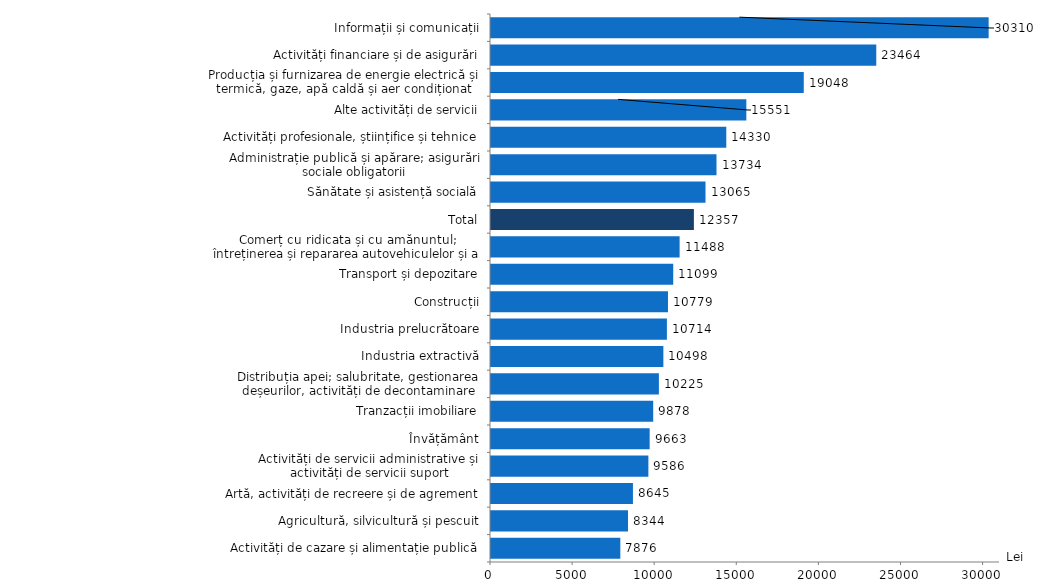
| Category | Lei |
|---|---|
| Activități de cazare și alimentație publică | 7876.2 |
| Agricultură, silvicultură și pescuit | 8344.3 |
| Artă, activități de recreere și de agrement | 8644.9 |
| Activități de servicii administrative și activități de servicii suport | 9585.6 |
| Învățământ | 9662.9 |
| Tranzacții imobiliare | 9878.4 |
| Distribuția apei; salubritate, gestionarea deșeurilor, activități de decontaminare | 10225.1 |
| Industria extractivă | 10497.7 |
| Industria prelucrătoare | 10713.5 |
| Construcții | 10778.8 |
| Transport și depozitare | 11098.6 |
| Comerț cu ridicata și cu amănuntul; întreținerea și repararea autovehiculelor și a motocicletelor | 11487.7 |
| Total | 12357.2 |
| Sănătate și asistență socială | 13064.8 |
| Administrație publică și apărare; asigurări sociale obligatorii | 13733.9 |
| Activități profesionale, științifice și tehnice | 14330 |
| Alte activități de servicii | 15550.6 |
| Producția și furnizarea de energie electrică și termică, gaze, apă caldă și aer condiționat | 19048.4 |
| Activități financiare și de asigurări | 23463.7 |
| Informații și comunicații | 30309.5 |